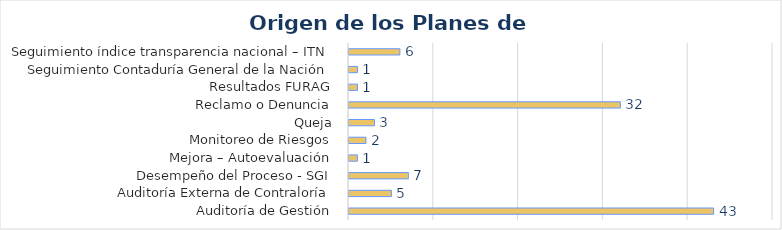
| Category | Total |
|---|---|
| Auditoría de Gestión | 43 |
| Auditoría Externa de Contraloría | 5 |
| Desempeño del Proceso - SGI | 7 |
| Mejora – Autoevaluación | 1 |
| Monitoreo de Riesgos | 2 |
| Queja, Reclamo o Denuncia | 3 |
| Resultados FURAG | 32 |
| Seguimiento Contaduría General de la Nación | 1 |
| Seguimiento índice transparencia nacional – ITN | 1 |
| Seguimientos OCI | 6 |